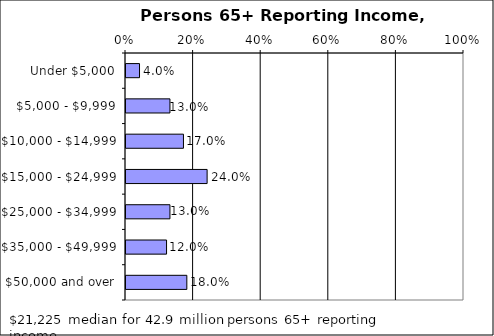
| Category | Persons 65+ Reporting Income Percent of persons |
|---|---|
| Under $5,000 | 0.04 |
| $5,000 - $9,999 | 0.13 |
| $10,000 - $14,999 | 0.17 |
| $15,000 - $24,999 | 0.24 |
| $25,000 - $34,999 | 0.13 |
| $35,000 - $49,999 | 0.12 |
| $50,000 and over | 0.18 |